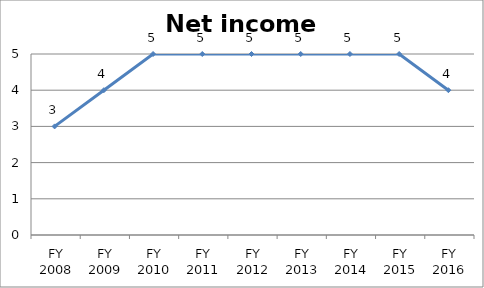
| Category | Net income score |
|---|---|
| FY 2016 | 4 |
| FY 2015 | 5 |
| FY 2014 | 5 |
| FY 2013 | 5 |
| FY 2012 | 5 |
| FY 2011 | 5 |
| FY 2010 | 5 |
| FY 2009 | 4 |
| FY 2008 | 3 |